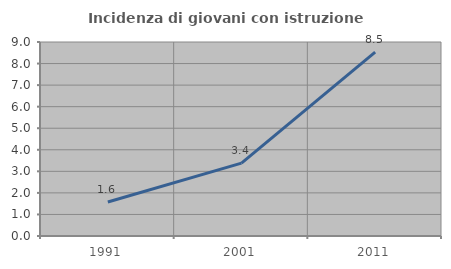
| Category | Incidenza di giovani con istruzione universitaria |
|---|---|
| 1991.0 | 1.579 |
| 2001.0 | 3.383 |
| 2011.0 | 8.527 |